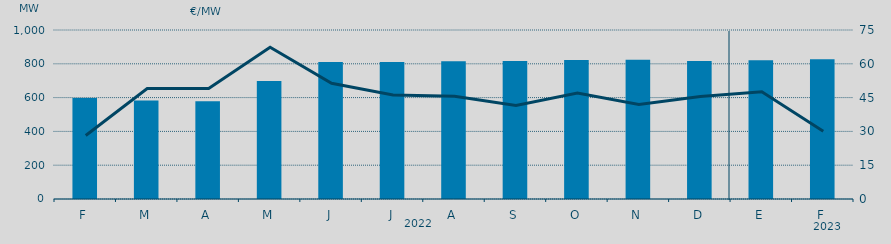
| Category | Potencia media a subir |
|---|---|
| F | 598.173 |
| M | 582.265 |
| A | 578.1 |
| M | 697.8 |
| J | 810.166 |
| J | 810.419 |
| A | 815.058 |
| S | 816.21 |
| O | 822.826 |
| N | 823.932 |
| D | 816.374 |
| E | 820.977 |
| F | 826.222 |